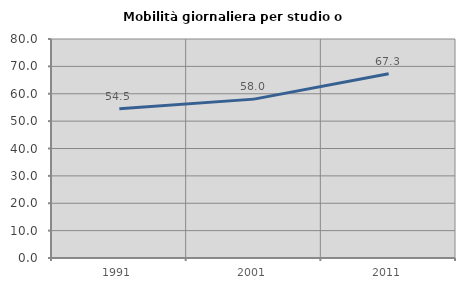
| Category | Mobilità giornaliera per studio o lavoro |
|---|---|
| 1991.0 | 54.478 |
| 2001.0 | 58.036 |
| 2011.0 | 67.29 |